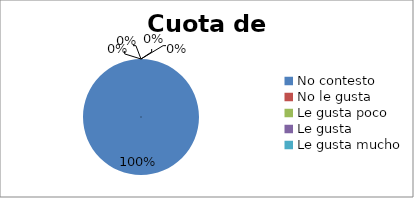
| Category | Series 0 |
|---|---|
| No contesto | 6 |
| No le gusta | 0 |
| Le gusta poco | 0 |
| Le gusta | 0 |
| Le gusta mucho | 0 |